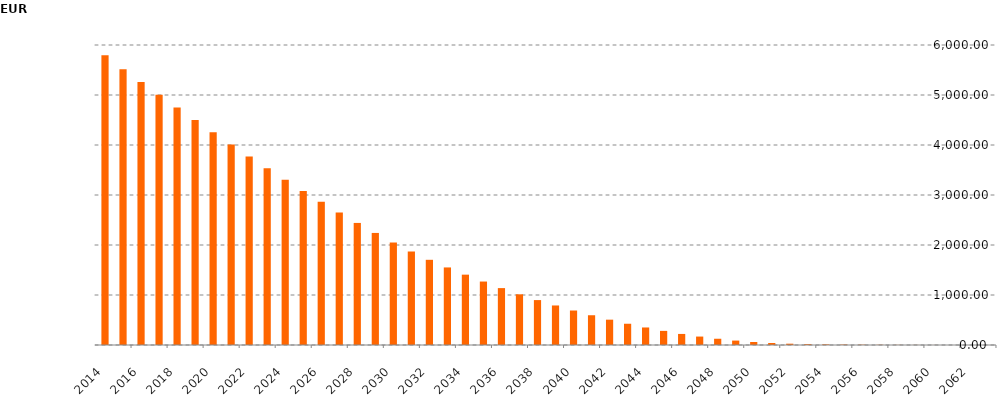
| Category | Series 0 |
|---|---|
| 2014-12-31 | 5793263158.8 |
| 2015-12-31 | 5513500867.87 |
| 2016-12-31 | 5258360472.68 |
| 2017-12-31 | 5004356118.02 |
| 2018-12-31 | 4751807976.22 |
| 2019-12-31 | 4501600516.7 |
| 2020-12-31 | 4254519467.58 |
| 2021-12-31 | 4010479071.21 |
| 2022-12-31 | 3770532218.6 |
| 2023-12-31 | 3535546757.87 |
| 2024-12-31 | 3305921965.22 |
| 2025-12-31 | 3081961450.63 |
| 2026-12-31 | 2863021471.6 |
| 2027-12-31 | 2649136463.69 |
| 2028-12-31 | 2441445740.92 |
| 2029-12-31 | 2241185422.74 |
| 2030-12-31 | 2049734752.73 |
| 2031-12-31 | 1870036227.51 |
| 2032-12-31 | 1703955390.35 |
| 2033-12-31 | 1551260155.75 |
| 2034-12-31 | 1406909093.59 |
| 2035-12-31 | 1269187225.5 |
| 2036-12-31 | 1137946575.77 |
| 2037-12-31 | 1013855075.48 |
| 2038-12-31 | 898347546 |
| 2039-12-31 | 790609917.37 |
| 2040-12-31 | 689748061.6 |
| 2041-12-31 | 595182325.35 |
| 2042-12-31 | 506718083.3 |
| 2043-12-31 | 425124589.91 |
| 2044-12-31 | 350564438.96 |
| 2045-12-31 | 282329295.91 |
| 2046-12-31 | 221260702.54 |
| 2047-12-31 | 168817865.93 |
| 2048-12-31 | 125051497.27 |
| 2049-12-31 | 88379496.61 |
| 2050-12-31 | 60350380.48 |
| 2051-12-31 | 40390510.03 |
| 2052-12-31 | 26045869.54 |
| 2053-12-31 | 17153771.86 |
| 2054-12-31 | 12223788.04 |
| 2055-12-31 | 8938121.65 |
| 2056-12-31 | 6263735 |
| 2057-12-31 | 4189011.28 |
| 2058-12-31 | 2654842.07 |
| 2059-12-31 | 1560326.27 |
| 2060-12-31 | 832487.51 |
| 2061-12-31 | 411026.1 |
| 2062-12-31 | 171433.59 |
| 2063-12-31 | 41601.62 |